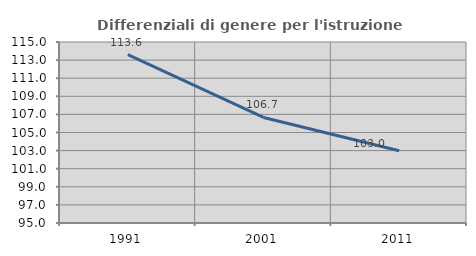
| Category | Differenziali di genere per l'istruzione superiore |
|---|---|
| 1991.0 | 113.602 |
| 2001.0 | 106.664 |
| 2011.0 | 102.976 |